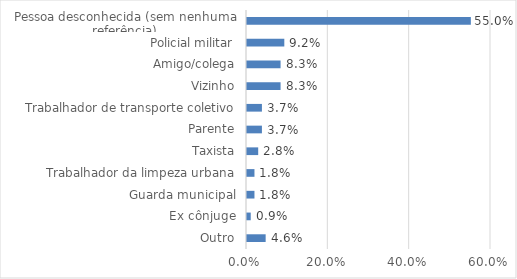
| Category | Series 0 |
|---|---|
| Outro | 0.046 |
| Ex cônjuge | 0.009 |
| Guarda municipal | 0.018 |
| Trabalhador da limpeza urbana | 0.018 |
| Taxista | 0.028 |
| Parente | 0.037 |
| Trabalhador de transporte coletivo | 0.037 |
| Vizinho | 0.083 |
| Amigo/colega | 0.083 |
| Policial militar | 0.092 |
| Pessoa desconhecida (sem nenhuma referência) | 0.55 |